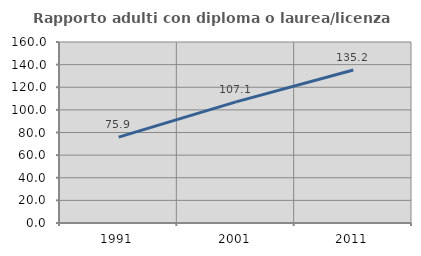
| Category | Rapporto adulti con diploma o laurea/licenza media  |
|---|---|
| 1991.0 | 75.926 |
| 2001.0 | 107.105 |
| 2011.0 | 135.219 |